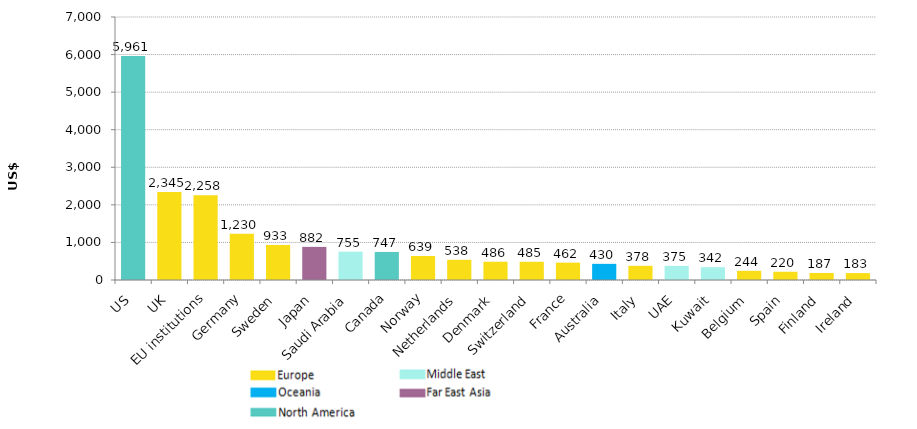
| Category | Series 0 |
|---|---|
| US | 5961.431 |
| UK | 2344.653 |
| EU institutions | 2258.342 |
| Germany | 1230.079 |
| Sweden | 932.666 |
| Japan | 881.756 |
| Saudi Arabia | 754.52 |
| Canada | 746.658 |
| Norway | 638.695 |
| Netherlands | 537.795 |
| Denmark | 486.141 |
| Switzerland | 484.586 |
| France | 462.05 |
| Australia | 429.981 |
| Italy | 377.934 |
| UAE | 375.49 |
| Kuwait | 341.894 |
| Belgium | 244.439 |
| Spain | 219.552 |
| Finland | 187.232 |
| Ireland | 183.287 |